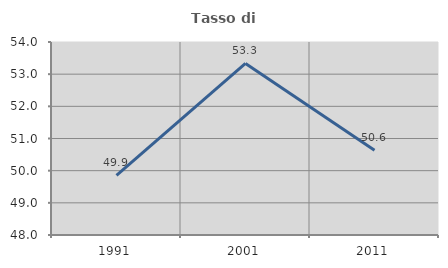
| Category | Tasso di occupazione   |
|---|---|
| 1991.0 | 49.854 |
| 2001.0 | 53.333 |
| 2011.0 | 50.638 |